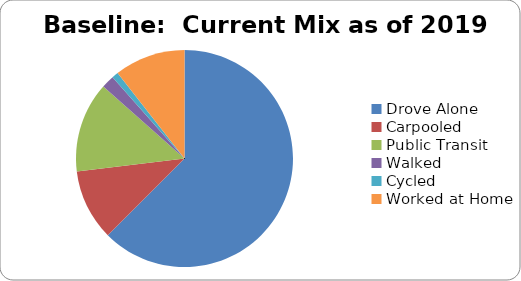
| Category | Baseline:  Current Mix as of 2019 |
|---|---|
| Drove Alone | 65 |
| Carpooled | 11 |
| Public Transit | 14 |
| Walked | 2 |
| Cycled | 1 |
| Worked at Home | 11 |